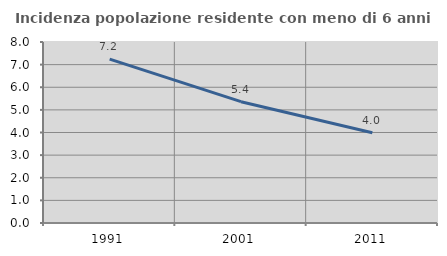
| Category | Incidenza popolazione residente con meno di 6 anni |
|---|---|
| 1991.0 | 7.243 |
| 2001.0 | 5.362 |
| 2011.0 | 3.992 |